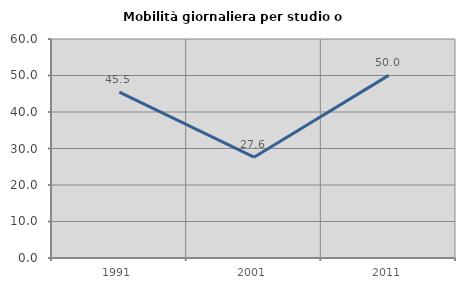
| Category | Mobilità giornaliera per studio o lavoro |
|---|---|
| 1991.0 | 45.456 |
| 2001.0 | 27.625 |
| 2011.0 | 50.039 |